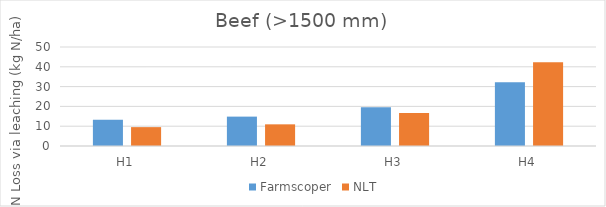
| Category | Farmscoper | NLT |
|---|---|---|
| H1 | 13.257 | 9.53 |
| H2 | 14.84 | 10.94 |
| H3 | 19.589 | 16.63 |
| H4 | 32.251 | 42.35 |